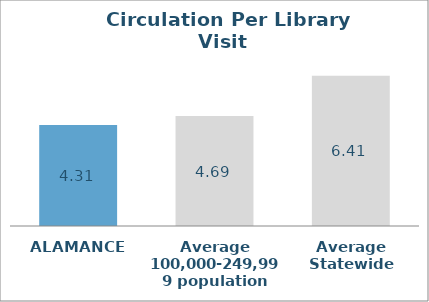
| Category | Series 0 |
|---|---|
| ALAMANCE | 4.309 |
| Average 100,000-249,999 population | 4.69 |
| Average Statewide | 6.409 |